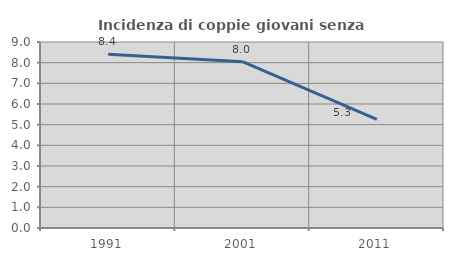
| Category | Incidenza di coppie giovani senza figli |
|---|---|
| 1991.0 | 8.404 |
| 2001.0 | 8.047 |
| 2011.0 | 5.256 |